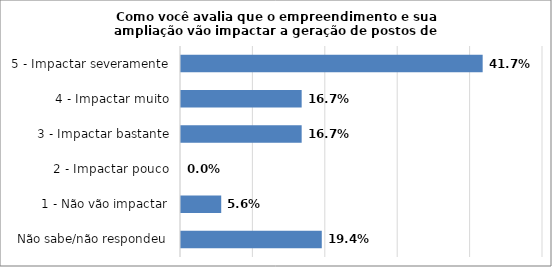
| Category | Series 0 |
|---|---|
| Não sabe/não respondeu | 0.194 |
| 1 - Não vão impactar | 0.056 |
| 2 - Impactar pouco | 0 |
| 3 - Impactar bastante | 0.167 |
| 4 - Impactar muito | 0.167 |
| 5 - Impactar severamente | 0.417 |